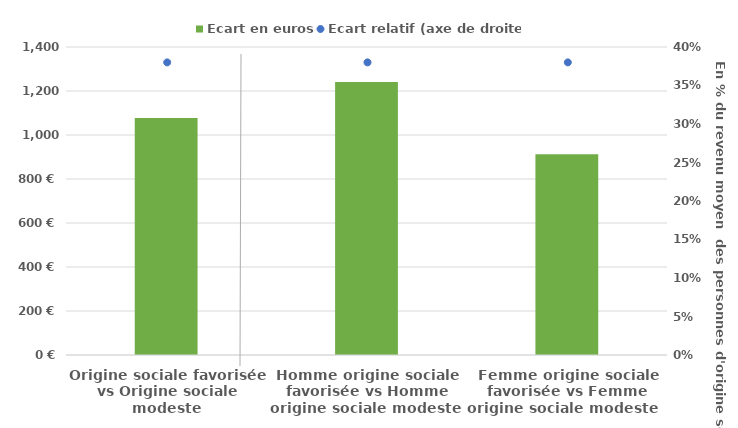
| Category | Ecart en euros |
|---|---|
| Origine sociale favorisée vs Origine sociale modeste | 1077 |
| Homme origine sociale favorisée vs Homme origine sociale modeste  | 1241 |
| Femme origine sociale favorisée vs Femme origine sociale modeste      | 912 |